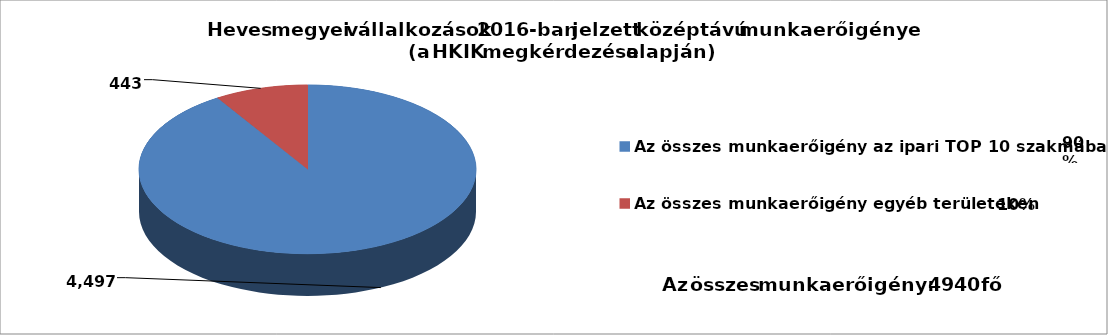
| Category | Series 0 |
|---|---|
| Az összes munkaerőigény az ipari TOP 10 szakmában | 4497 |
| Az összes munkaerőigény egyéb területeken | 443 |